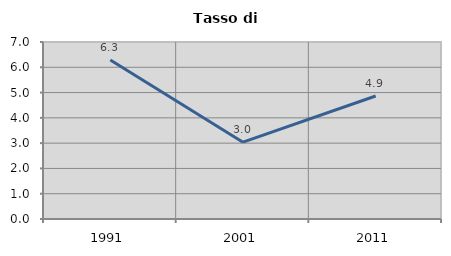
| Category | Tasso di disoccupazione   |
|---|---|
| 1991.0 | 6.285 |
| 2001.0 | 3.039 |
| 2011.0 | 4.865 |